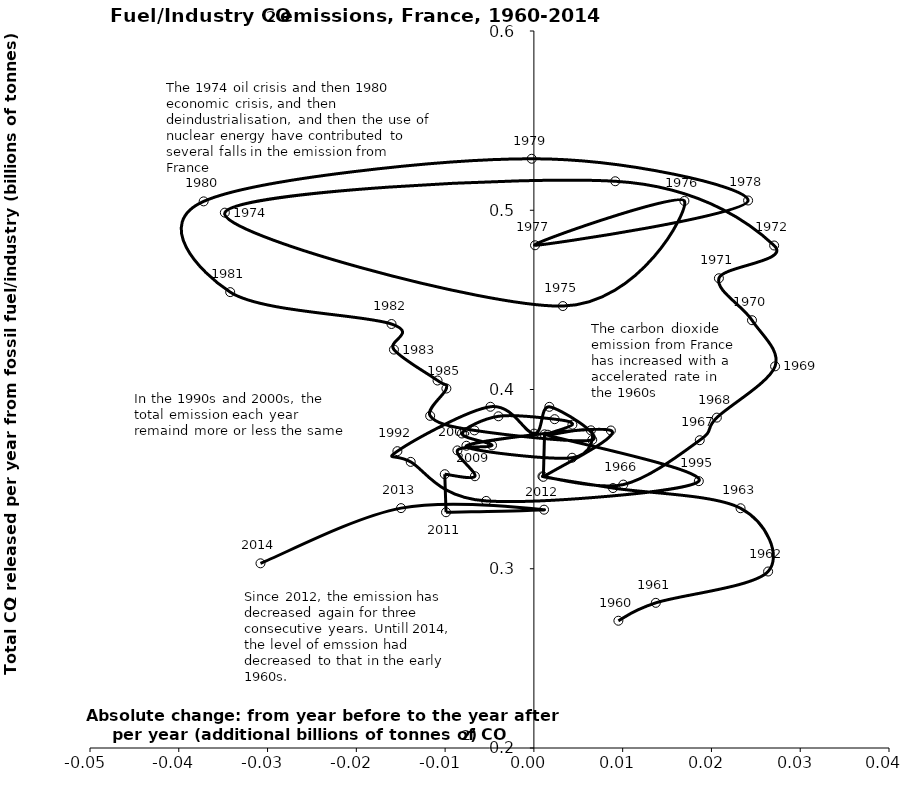
| Category | Series 0 |
|---|---|
| 0.00951724000000001 | 0.271 |
| 0.013732672000000001 | 0.281 |
| 0.026382632000000017 | 0.298 |
| 0.023279224000000015 | 0.334 |
| 0.008909015999999992 | 0.345 |
| 0.0009654639999999992 | 0.352 |
| 0.01007050399999998 | 0.347 |
| 0.018682735999999978 | 0.372 |
| 0.020608168000000038 | 0.384 |
| 0.027168560000000008 | 0.413 |
| 0.02456711999999997 | 0.439 |
| 0.020840832000000004 | 0.462 |
| 0.027060472000000002 | 0.48 |
| 0.009163663999999988 | 0.516 |
| -0.03481166399999999 | 0.499 |
| 0.003262792000000042 | 0.447 |
| 0.016955159999999997 | 0.505 |
| 0.00012823999999994617 | 0.48 |
| 0.024129272000000035 | 0.505 |
| -0.0002473199999999953 | 0.529 |
| -0.037196928000000046 | 0.505 |
| -0.03420710399999999 | 0.454 |
| -0.016035495999999982 | 0.437 |
| -0.015762527999999998 | 0.422 |
| -0.010852768000000013 | 0.405 |
| -0.009856160000000003 | 0.401 |
| -0.011684495999999989 | 0.385 |
| -0.006697792000000008 | 0.377 |
| 0.006573215999999993 | 0.372 |
| 0.0017404000000000308 | 0.39 |
| 2.0151999999995507e-05 | 0.375 |
| -0.004895104000000011 | 0.39 |
| -0.015374143999999978 | 0.366 |
| -0.013875568000000005 | 0.36 |
| -0.005373256000000021 | 0.338 |
| 0.018578311999999986 | 0.349 |
| 0.00119996 | 0.375 |
| 0.0010680560000000117 | 0.351 |
| 0.008670856000000005 | 0.377 |
| -0.007602799999999993 | 0.369 |
| 0.004305200000000009 | 0.362 |
| 0.006419328000000002 | 0.377 |
| 0.001575519999999997 | 0.375 |
| 0.004338175999999999 | 0.38 |
| 0.002337632000000006 | 0.383 |
| -0.003993760000000013 | 0.385 |
| -0.008106599999999992 | 0.375 |
| -0.0047155679999999756 | 0.369 |
| -0.008614064000000032 | 0.366 |
| -0.006641000000000008 | 0.352 |
| -0.010039359999999997 | 0.353 |
| -0.009894632000000014 | 0.332 |
| 0.0011450000000000071 | 0.333 |
| -0.014963775999999984 | 0.334 |
| -0.030795919999999977 | 0.303 |